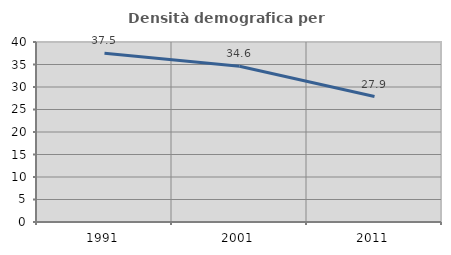
| Category | Densità demografica |
|---|---|
| 1991.0 | 37.522 |
| 2001.0 | 34.625 |
| 2011.0 | 27.873 |